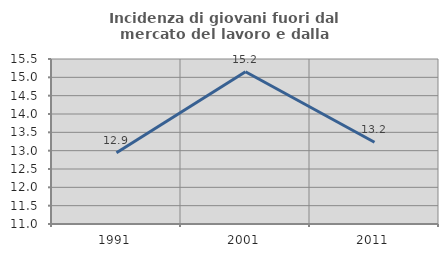
| Category | Incidenza di giovani fuori dal mercato del lavoro e dalla formazione  |
|---|---|
| 1991.0 | 12.943 |
| 2001.0 | 15.152 |
| 2011.0 | 13.23 |